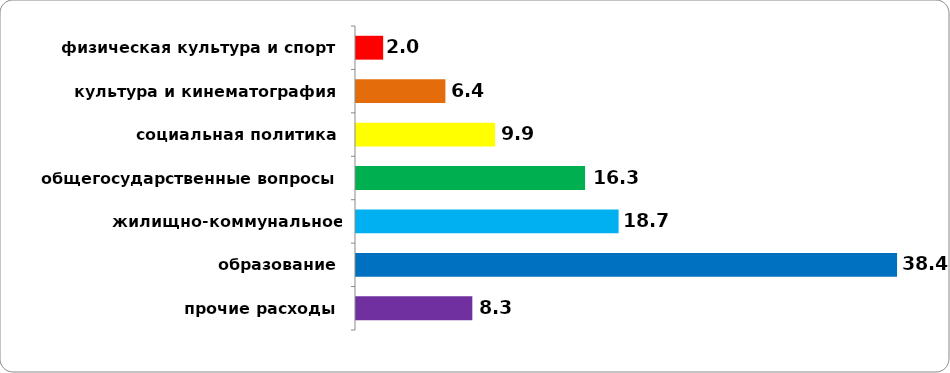
| Category | Series 0 |
|---|---|
| прочие расходы | 8.306 |
| образование | 38.377 |
| жилищно-коммунальное хозяйство | 18.662 |
| общегосударственные вопросы | 16.288 |
| социальная политика | 9.916 |
|  культура и кинематография | 6.4 |
| физическая культура и спорт | 1.994 |